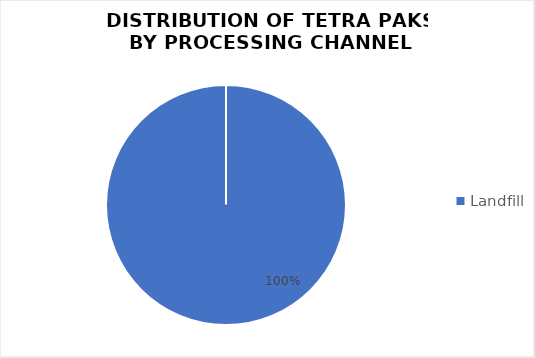
| Category | Series 0 |
|---|---|
| Landfill | 872 |